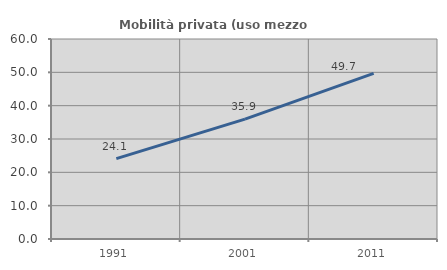
| Category | Mobilità privata (uso mezzo privato) |
|---|---|
| 1991.0 | 24.115 |
| 2001.0 | 35.946 |
| 2011.0 | 49.713 |